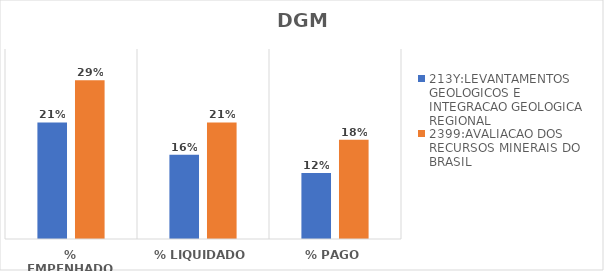
| Category | 213Y:LEVANTAMENTOS GEOLOGICOS E INTEGRACAO GEOLOGICA REGIONAL | 2399:AVALIACAO DOS RECURSOS MINERAIS DO BRASIL |
|---|---|---|
| % EMPENHADO | 0.215 | 0.292 |
| % LIQUIDADO | 0.155 | 0.215 |
| % PAGO | 0.122 | 0.183 |